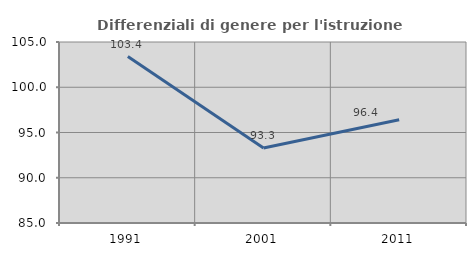
| Category | Differenziali di genere per l'istruzione superiore |
|---|---|
| 1991.0 | 103.397 |
| 2001.0 | 93.283 |
| 2011.0 | 96.412 |